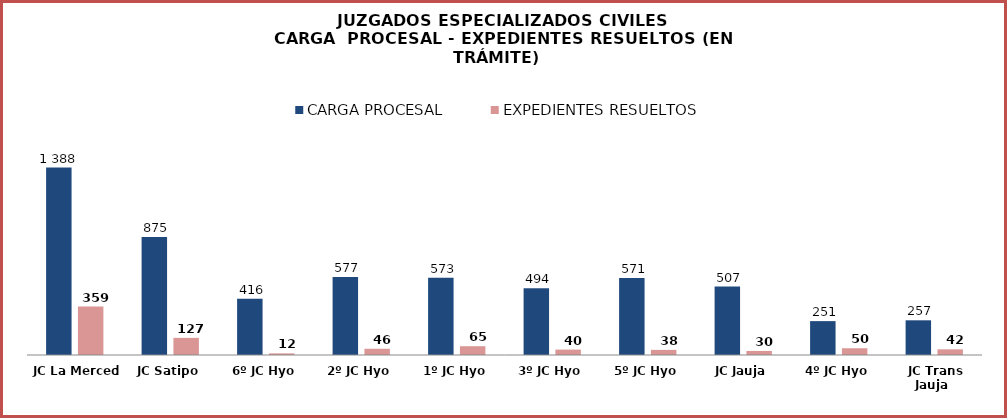
| Category | CARGA PROCESAL | EXPEDIENTES RESUELTOS |
|---|---|---|
| JC La Merced | 1388 | 359 |
| JC Satipo | 875 | 127 |
| 6º JC Hyo | 416 | 12 |
| 2º JC Hyo | 577 | 46 |
| 1º JC Hyo | 573 | 65 |
| 3º JC Hyo | 494 | 40 |
| 5º JC Hyo | 571 | 38 |
| JC Jauja | 507 | 30 |
| 4º JC Hyo | 251 | 50 |
| JC Trans Jauja | 257 | 42 |